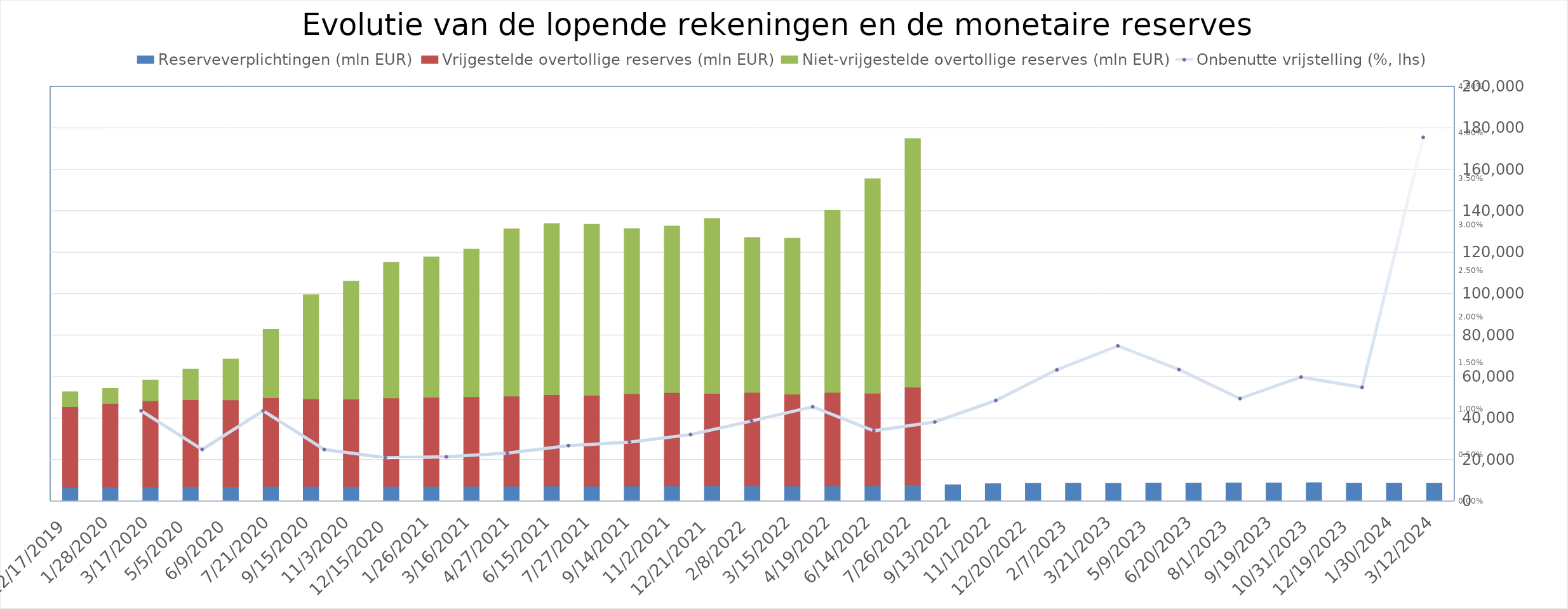
| Category | Reserveverplichtingen (mln EUR) | Vrijgestelde overtollige reserves (mln EUR) | Niet-vrijgestelde overtollige reserves (mln EUR) |
|---|---|---|---|
| 3/12/24 | 8722 | 0 | 0 |
| 1/30/24 | 8741.019 | 0 | 0 |
| 12/19/23 | 8762 | 0 | 0 |
| 10/31/23 | 9001 | 0 | 0 |
| 9/19/23 | 8896 | 0 | 0 |
| 8/1/23 | 8904 | 0 | 0 |
| 6/20/23 | 8799 | 0 | 0 |
| 5/9/23 | 8796 | 0 | 0 |
| 3/21/23 | 8668 | 0 | 0 |
| 2/7/23 | 8736 | 0 | 0 |
| 12/20/22 | 8689 | 0 | 0 |
| 11/1/22 | 8517 | 0 | 0 |
| 9/13/22 | 8018 | 0 | 0 |
| 7/26/22 | 7929 | 47109 | 119909 |
| 6/14/22 | 7495 | 44621 | 103454 |
| 4/19/22 | 7536 | 44962 | 87885 |
| 3/15/22 | 7409 | 44244 | 75192 |
| 2/8/22 | 7536 | 44997 | 74696 |
| 12/21/21 | 7472 | 44599 | 84381 |
| 11/2/21 | 7531 | 44914 | 80355 |
| 9/14/21 | 7460 | 44471 | 79647 |
| 7/27/21 | 7352 | 43793 | 82435 |
| 6/15/21 | 7404 | 44036 | 82520 |
| 4/27/21 | 7313 | 43430 | 80697 |
| 3/16/21 | 7254 | 43192 | 71224 |
| 1/26/21 | 7225 | 42978 | 67723 |
| 12/15/20 | 7190 | 42671 | 65344 |
| 11/3/20 | 7128 | 42161 | 56951 |
| 9/15/20 | 7165 | 42265 | 50289 |
| 7/21/20 | 7217 | 42685 | 33099 |
| 6/9/20 | 7060 | 41891 | 19741 |
| 5/5/20 | 7085 | 41937 | 14783 |
| 3/17/20 | 7002 | 41491 | 10061 |
| 1/28/20 | 6981 | 40234 | 7303 |
| 12/17/19 | 6887 | 38752 | 7220 |